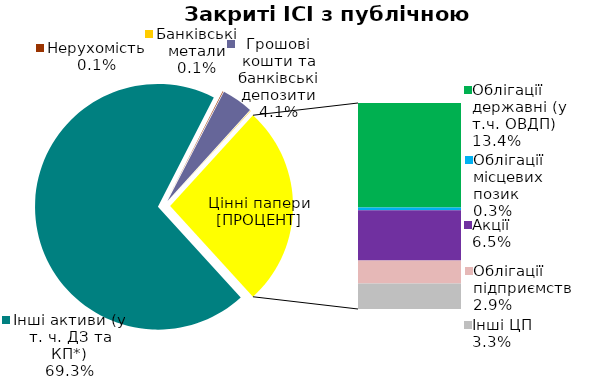
| Category | Series 0 |
|---|---|
| Інші активи (у т. ч. ДЗ та КП*) | 0.693 |
| Нерухомість | 0.001 |
| Грошові кошти та банківські депозити | 0.041 |
| Банківські метали | 0.001 |
| Облігації державні (у т.ч. ОВДП) | 0.134 |
| Облігації місцевих позик | 0.003 |
| Акції | 0.065 |
| Облігації підприємств | 0.029 |
| Векселі | 0 |
| Інші ЦП | 0.033 |